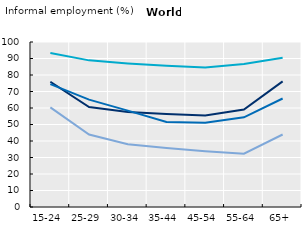
| Category | Total | Employees | Employers | Own-account workers |
|---|---|---|---|---|
| 15-24 | 75.923 | 60.418 | 74.496 | 93.355 |
| 25-29 | 60.58 | 43.902 | 65.094 | 88.866 |
| 30-34 | 57.586 | 38.072 | 58.402 | 87.038 |
| 35-44 | 56.348 | 35.802 | 51.561 | 85.612 |
| 45-54 | 55.517 | 33.789 | 51.04 | 84.587 |
| 55-64 | 59.037 | 32.296 | 54.328 | 86.656 |
| 65+ | 76.106 | 43.952 | 65.763 | 90.396 |